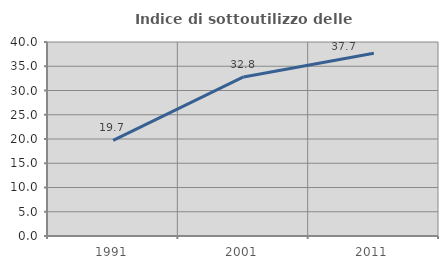
| Category | Indice di sottoutilizzo delle abitazioni  |
|---|---|
| 1991.0 | 19.722 |
| 2001.0 | 32.803 |
| 2011.0 | 37.7 |